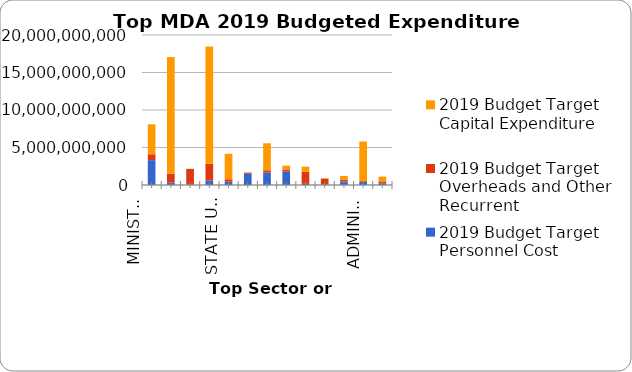
| Category | 2019 Budget Target Personnel Cost | 2019 Budget Target Overheads and Other Recurrent | 2019 Budget Target Capital Expenditure |
|---|---|---|---|
| MINISTRY OF HEALTH | 3314750000 | 779400000 | 4000000000 |
| MINISTRY OF EDUCATION | 317000000 | 1200440000 | 15536872200 |
| GOVERNMENT HOUSE | 47201440 | 2105081070 | 0 |
| CABINET AFFAIRS DEPARTMENT | 600000000 | 2230000000 | 15620120643 |
| MINISTRY OF FINANCE | 430900000 | 337651634 | 3392000000 |
| SECONDARY SCHOOLS MANAGEMENT BOARD | 1500000000 | 160000000 | 0 |
| STATE UNIVERSAL BASIC EDUCATION BOARD {SUBEB} | 1655000000 | 310000000 | 3600000000 |
| KEBBI STATE UNIVERSITY ALEIRO | 1788000000 | 278000000 | 520000000 |
| STATE HOUSE OF ASSEMBLY | 148129184 | 1624530779 | 675000000 |
| MINISTRY OF JUSTICE | 99981499 | 703300000 | 110000000 |
| SHARIA COURT | 475000000 | 247000000 | 490000000 |
| MINISTRY OF HIGHER EDUCATION | 400000000 | 110000000 | 5297000000 |
| ADMINISTRATION DEPARTMENT | 217000000 | 263923308 | 637000000 |